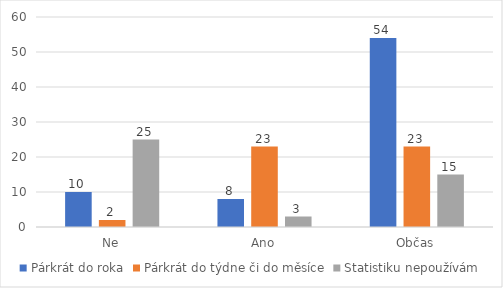
| Category | Párkrát do roka | Párkrát do týdne či do měsíce | Statistiku nepoužívám |
|---|---|---|---|
| Ne | 10 | 2 | 25 |
| Ano | 8 | 23 | 3 |
| Občas | 54 | 23 | 15 |